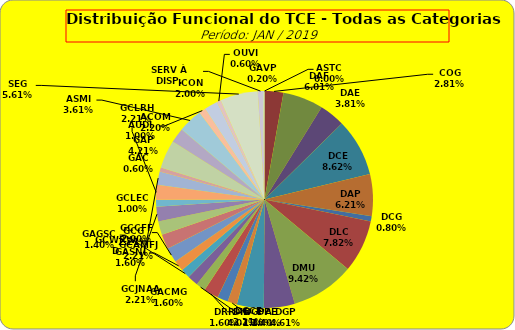
| Category | ASTC |
|---|---|
| ASTC | 0 |
| COG | 14 |
| DAF | 30 |
| DAE | 19 |
| DCE | 43 |
| DAP | 31 |
| DCG | 4 |
| DLC | 39 |
| DMU | 47 |
| DGP | 23 |
| DIN | 20 |
| DPE | 7 |
| DRR | 8 |
| DGCE | 11 |
| DGPA | 7 |
| GACMG | 8 |
| GAGSC | 7 |
| GASNI | 8 |
| GCG | 11 |
| GCAMFJ | 11 |
| GCCFF | 10 |
| GCJNAA | 11 |
| GCLEC | 5 |
| GCLRH | 11 |
| GCWRWD | 10 |
| GAC | 3 |
| GAP | 21 |
| ACOM | 11 |
| ASMI | 18 |
| AUDI | 5 |
| ICON | 10 |
| OUVI | 3 |
| SEG | 28 |
| SERV À DISP. | 4 |
| GAVP | 1 |